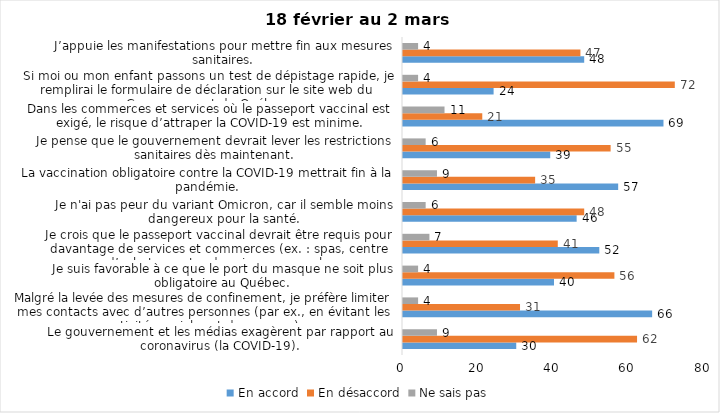
| Category | En accord | En désaccord | Ne sais pas |
|---|---|---|---|
| Le gouvernement et les médias exagèrent par rapport au coronavirus (la COVID-19). | 30 | 62 | 9 |
| Malgré la levée des mesures de confinement, je préfère limiter mes contacts avec d’autres personnes (par ex., en évitant les activités sociales et de groupes) | 66 | 31 | 4 |
| Je suis favorable à ce que le port du masque ne soit plus obligatoire au Québec. | 40 | 56 | 4 |
| Je crois que le passeport vaccinal devrait être requis pour davantage de services et commerces (ex. : spas, centre d’achats, centre de soins personnels. | 52 | 41 | 7 |
| Je n'ai pas peur du variant Omicron, car il semble moins dangereux pour la santé. | 46 | 48 | 6 |
| La vaccination obligatoire contre la COVID-19 mettrait fin à la pandémie. | 57 | 35 | 9 |
| Je pense que le gouvernement devrait lever les restrictions sanitaires dès maintenant. | 39 | 55 | 6 |
| Dans les commerces et services où le passeport vaccinal est exigé, le risque d’attraper la COVID-19 est minime. | 69 | 21 | 11 |
| Si moi ou mon enfant passons un test de dépistage rapide, je remplirai le formulaire de déclaration sur le site web du Gouvernement du Québec. | 24 | 72 | 4 |
| J’appuie les manifestations pour mettre fin aux mesures sanitaires. | 48 | 47 | 4 |